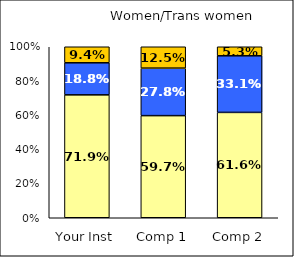
| Category | Low Institutional Priority: Increase Prestige | Average Institutional Priority: Increase Prestige | High Institutional Priority: Increase Prestige |
|---|---|---|---|
| Your Inst | 0.719 | 0.188 | 0.094 |
| Comp 1 | 0.597 | 0.278 | 0.125 |
| Comp 2 | 0.616 | 0.331 | 0.053 |